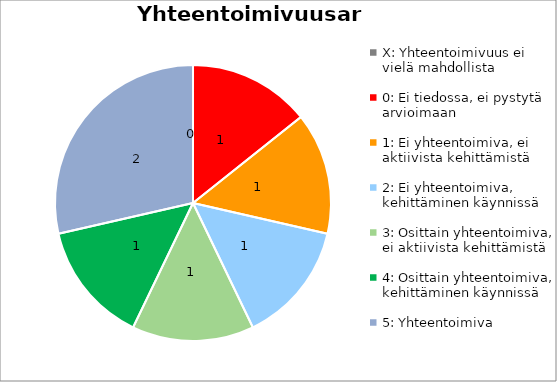
| Category | Series 0 |
|---|---|
| X: Yhteentoimivuus ei vielä mahdollista | 0 |
| 0: Ei tiedossa, ei pystytä arvioimaan | 1 |
| 1: Ei yhteentoimiva, ei aktiivista kehittämistä | 1 |
| 2: Ei yhteentoimiva, kehittäminen käynnissä | 1 |
| 3: Osittain yhteentoimiva, ei aktiivista kehittämistä | 1 |
| 4: Osittain yhteentoimiva, kehittäminen käynnissä | 1 |
| 5: Yhteentoimiva | 2 |